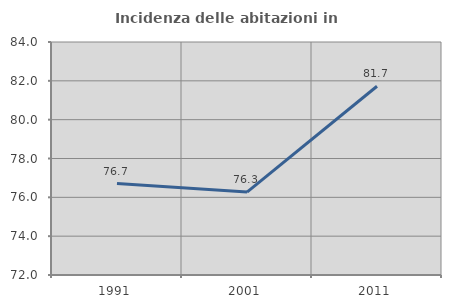
| Category | Incidenza delle abitazioni in proprietà  |
|---|---|
| 1991.0 | 76.712 |
| 2001.0 | 76.271 |
| 2011.0 | 81.72 |